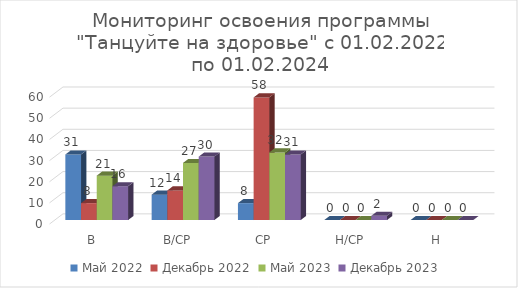
| Category | Май 2022 | Декабрь 2022 | Май 2023 | Декабрь 2023  |
|---|---|---|---|---|
| В | 31 | 8 | 21 | 16 |
| В/СР | 12 | 14 | 27 | 30 |
| СР | 8 | 58 | 32 | 31 |
| Н/СР | 0 | 0 | 0 | 2 |
| Н | 0 | 0 | 0 | 0 |